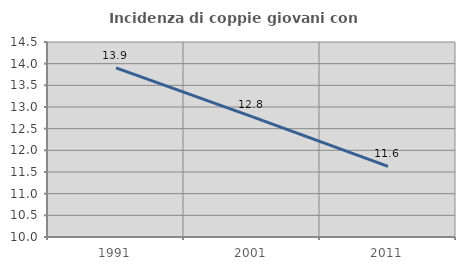
| Category | Incidenza di coppie giovani con figli |
|---|---|
| 1991.0 | 13.904 |
| 2001.0 | 12.778 |
| 2011.0 | 11.628 |